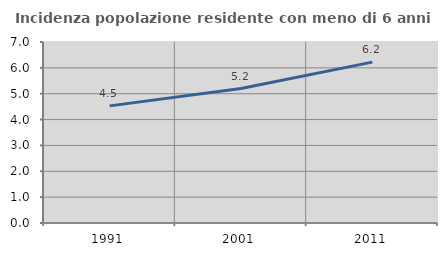
| Category | Incidenza popolazione residente con meno di 6 anni |
|---|---|
| 1991.0 | 4.53 |
| 2001.0 | 5.201 |
| 2011.0 | 6.222 |